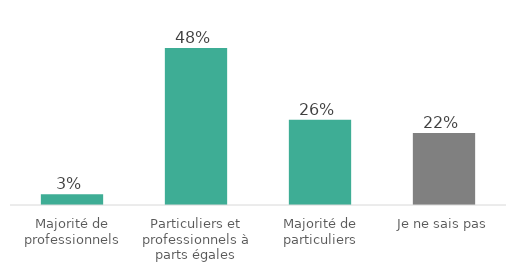
| Category | Series 0 |
|---|---|
| Majorité de professionnels | 3.307 |
| Particuliers et professionnels à parts égales | 48.27 |
| Majorité de particuliers | 26.244 |
| Je ne sais pas | 22.178 |